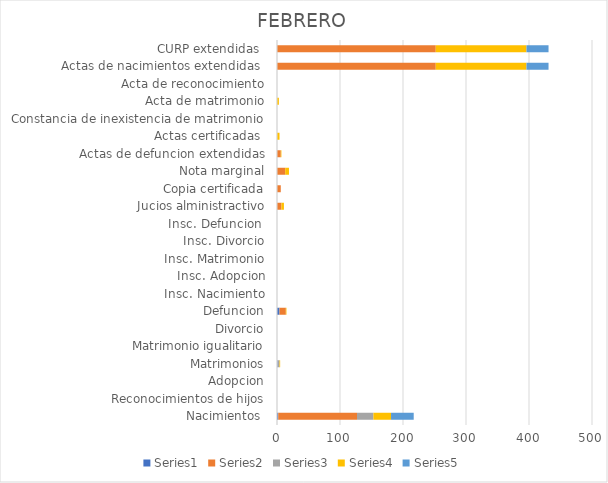
| Category | Series 0 | Series 1 | Series 2 | Series 3 | Series 4 |
|---|---|---|---|---|---|
| Nacimientos  | 2 | 125 | 26 | 28 | 36 |
| Reconocimientos de hijos | 0 | 0 | 0 | 0 | 0 |
| Adopcion | 0 | 0 | 0 | 0 | 0 |
| Matrimonios | 1 | 0 | 3 | 1 | 0 |
| Matrimonio igualitario | 0 | 0 | 0 | 0 | 0 |
| Divorcio | 0 | 0 | 0 | 0 | 0 |
| Defuncion | 4 | 10 | 0 | 1 | 0 |
| Insc. Nacimiento | 0 | 0 | 0 | 0 | 0 |
| Insc. Adopcion | 0 | 0 | 0 | 0 | 0 |
| Insc. Matrimonio | 0 | 0 | 0 | 0 | 0 |
| Insc. Divorcio | 0 | 0 | 0 | 0 | 0 |
| Insc. Defuncion  | 0 | 0 | 0 | 0 | 0 |
| Jucios alministractivo | 0 | 7 | 0 | 4 | 0 |
| Copia certificada | 0 | 6 | 0 | 0 | 0 |
| Nota marginal | 0 | 13 | 0 | 6 | 0 |
| Actas de defuncion extendidas | 0 | 6 | 0 | 1 | 0 |
| Actas certificadas  | 0 | 0 | 0 | 4 | 0 |
| Constancia de inexistencia de matrimonio | 0 | 0 | 0 | 0 | 0 |
| Acta de matrimonio | 0 | 0 | 0 | 3 | 0 |
| Acta de reconocimiento | 0 | 0 | 0 | 0 | 0 |
| Actas de nacimientos extendidas  | 0 | 252 | 0 | 144 | 35 |
| CURP extendidas  | 0 | 252 | 0 | 144 | 35 |